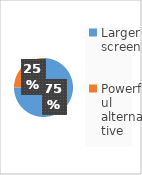
| Category | Series 0 |
|---|---|
| Larger screen | 3 |
| Powerful alternative | 1 |